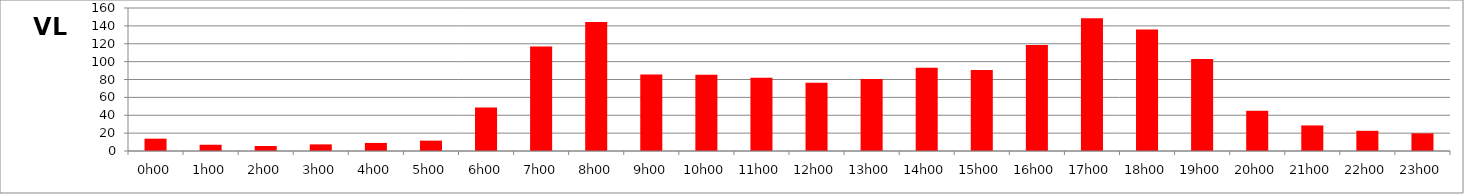
| Category | VL |
|---|---|
| 0.0 | 13.8 |
| 0.041666666666666664 | 7 |
| 0.08333333333333333 | 5.6 |
| 0.125 | 7.4 |
| 0.16666666666666666 | 9 |
| 0.20833333333333334 | 11.6 |
| 0.25 | 48.8 |
| 0.2916666666666667 | 116.8 |
| 0.3333333333333333 | 144.2 |
| 0.375 | 85.6 |
| 0.4166666666666667 | 85.2 |
| 0.4583333333333333 | 82 |
| 0.5 | 76.4 |
| 0.5416666666666666 | 80.6 |
| 0.5833333333333334 | 93.2 |
| 0.625 | 90.6 |
| 0.6666666666666666 | 118.6 |
| 0.7083333333333334 | 148.4 |
| 0.75 | 136 |
| 0.7916666666666666 | 102.8 |
| 0.8333333333333334 | 45 |
| 0.875 | 28.6 |
| 0.9166666666666666 | 22.6 |
| 0.9583333333333334 | 19.8 |